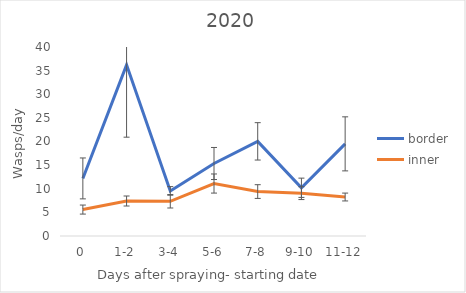
| Category | border | inner |
|---|---|---|
| 0 | 12.188 | 5.594 |
| 1-2 | 36.219 | 7.406 |
| 3-4 | 9.542 | 7.347 |
| 5-6 | 15.344 | 11.104 |
| 7-8 | 20.031 | 9.406 |
| 9-10 | 10.208 | 9.069 |
| 11-12 | 19.5 | 8.25 |